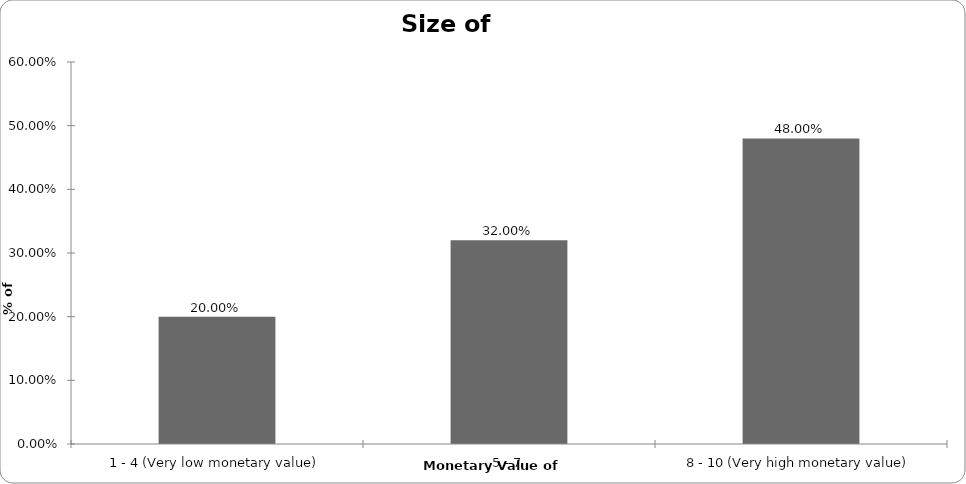
| Category | % of Consumer Respondents |
|---|---|
| 1 - 4 (Very low monetary value) | 0.2 |
| 5 - 7 | 0.32 |
| 8 - 10 (Very high monetary value) | 0.48 |